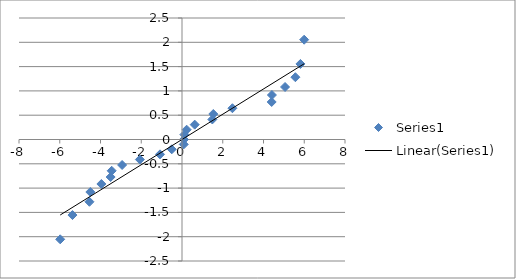
| Category | Series 0 |
|---|---|
| -5.9779421310354905 | -2.054 |
| -5.375256086462528 | -1.555 |
| -4.5426624134885145 | -1.282 |
| -4.499033299423829 | -1.08 |
| -3.9564383820627995 | -0.915 |
| -3.503830638102201 | -0.772 |
| -3.4505903808933738 | -0.643 |
| -2.939235909490918 | -0.524 |
| -2.067232806527173 | -0.412 |
| -1.0792689378298803 | -0.305 |
| -0.503501076580406 | -0.202 |
| 0.08594035034600722 | -0.1 |
| 0.09410343463221693 | 0 |
| 0.11709834776142714 | 0.1 |
| 0.22912840052892847 | 0.202 |
| 0.6237050195151568 | 0.305 |
| 1.4883707225383915 | 0.412 |
| 1.5361144823274486 | 0.524 |
| 2.474936427908588 | 0.643 |
| 4.401786394266253 | 0.772 |
| 4.413644069899618 | 0.915 |
| 5.056827670535199 | 1.08 |
| 5.5650550548957085 | 1.282 |
| 5.812428203248871 | 1.555 |
| 5.9958534834931925 | 2.054 |